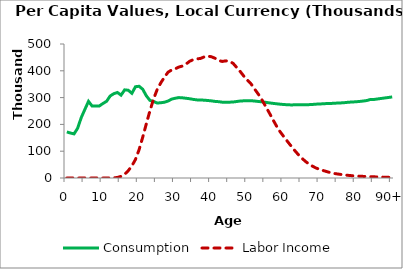
| Category | Consumption | Labor Income |
|---|---|---|
| 0 | 171777.618 | 0 |
|  | 167852.801 | 0 |
| 2 | 164630.925 | 0 |
| 3 | 185750.267 | 0 |
| 4 | 225719.147 | 0 |
| 5 | 256031.283 | 0 |
| 6 | 286004.983 | 0 |
| 7 | 268418.973 | 0 |
| 8 | 268617.897 | 0 |
| 9 | 268821.956 | 0 |
| 10 | 278021.626 | 0 |
| 11 | 286207.698 | 3.733 |
| 12 | 306050.547 | 98.209 |
| 13 | 314666.377 | 478.236 |
| 14 | 319113.389 | 2119.545 |
| 15 | 309128.311 | 6061.518 |
| 16 | 328842.71 | 14072.501 |
| 17 | 327495.578 | 27497.796 |
| 18 | 316023.692 | 45087.119 |
| 19 | 340635.109 | 69419.172 |
| 20 | 342259.987 | 105821.658 |
| 21 | 331098.22 | 152436.783 |
| 22 | 306499.416 | 202608.195 |
| 23 | 289511.63 | 251012.677 |
| 24 | 285564.972 | 294906.325 |
| 25 | 279737.819 | 330186.05 |
| 26 | 280785.507 | 355142.362 |
| 27 | 282715.061 | 376143.4 |
| 28 | 287132.405 | 394692.816 |
| 29 | 294316.18 | 403150.045 |
| 30 | 297677.066 | 407521.886 |
| 31 | 300027.924 | 413990.943 |
| 32 | 299166.753 | 417964.465 |
| 33 | 297439.168 | 425473.275 |
| 34 | 295735.919 | 435717.436 |
| 35 | 293257.838 | 441775.271 |
| 36 | 291445.378 | 444364.952 |
| 37 | 291276.617 | 446226.467 |
| 38 | 290299.231 | 451901.288 |
| 39 | 289187.845 | 454838.51 |
| 40 | 287752.061 | 452407.643 |
| 41 | 285854.206 | 446754.07 |
| 42 | 284772.609 | 438271.294 |
| 43 | 282886.103 | 434906.747 |
| 44 | 282468.594 | 437092.256 |
| 45 | 282915.286 | 435855.898 |
| 46 | 283574.738 | 427645.442 |
| 47 | 285472.07 | 412277.552 |
| 48 | 287262.469 | 396779.263 |
| 49 | 287975.918 | 379524.421 |
| 50 | 288261.742 | 364502.539 |
| 51 | 288418.478 | 350471.056 |
| 52 | 287055.77 | 331024.99 |
| 53 | 285492.19 | 312118.91 |
| 54 | 284108.579 | 290891.609 |
| 55 | 282391.739 | 267201.032 |
| 56 | 280314.955 | 243223.348 |
| 57 | 278557.515 | 218051.371 |
| 58 | 276957.816 | 193935.545 |
| 59 | 275427.587 | 172602.232 |
| 60 | 274232.267 | 154506.516 |
| 61 | 273292.589 | 137116.861 |
| 62 | 272738.474 | 119831.284 |
| 63 | 272951.472 | 103185.167 |
| 64 | 273506.538 | 87774.135 |
| 65 | 273575.263 | 74045.932 |
| 66 | 273531.638 | 62021.025 |
| 67 | 273730.851 | 51636.33 |
| 68 | 274500.981 | 43646.255 |
| 69 | 275613.064 | 36792.201 |
| 70 | 276175.872 | 32287.286 |
| 71 | 277037.232 | 27545.61 |
| 72 | 277869.678 | 23508.13 |
| 73 | 277981.869 | 19709.386 |
| 74 | 279191.441 | 16813.456 |
| 75 | 279525.986 | 14814.537 |
| 76 | 280354.31 | 12955.538 |
| 77 | 281356.947 | 11166.041 |
| 78 | 282862.344 | 9681.874 |
| 79 | 283520.062 | 8353.718 |
| 80 | 284524.751 | 7409.944 |
| 81 | 285656.769 | 6693.934 |
| 82 | 287264.41 | 6008.548 |
| 83 | 289072.151 | 5350.539 |
| 84 | 293130.316 | 4841.095 |
| 85 | 293054.326 | 4317.06 |
| 86 | 294997.301 | 3889.409 |
| 87 | 296886.855 | 3455.22 |
| 88 | 298729.696 | 3008.461 |
| 89 | 300554.414 | 2546.548 |
| 90+ | 302442.221 | 2075.253 |